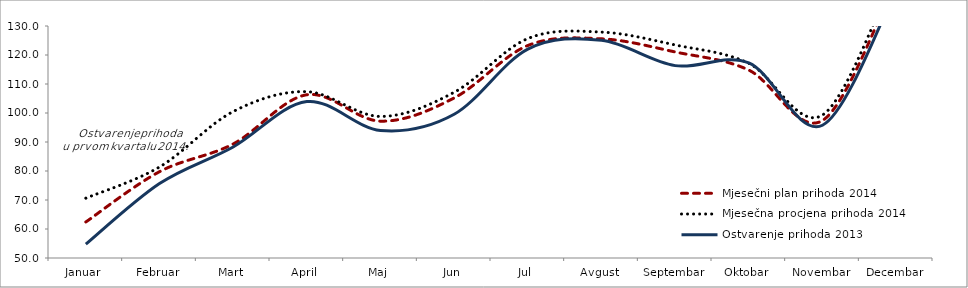
| Category | Mjesečni plan prihoda 2014 | Mjesečna procjena prihoda 2014 | Ostvarenje prihoda 2013 |
|---|---|---|---|
| Januar | 62425293.157 | 70632268.59 | 54757461.98 |
| Februar | 79762187.599 | 81381758.45 | 75673443.91 |
| Mart | 89318688.152 | 100495765.61 | 88296245.58 |
| April | 106294081.275 | 107356417.335 | 103948239.2 |
| Maj | 97189661.826 | 98816734.644 | 93997829.68 |
| Jun | 105191801.345 | 107147051.571 | 99561632.66 |
| Jul | 123272889.179 | 125666748.858 | 122021331.05 |
| Avgust | 125579133.653 | 127890096.387 | 125053427.65 |
| Septembar | 121047897.338 | 123465322.334 | 116342017.78 |
| Oktobar | 114789505.855 | 117130344.739 | 117283627.6 |
| Novembar | 97406301.48 | 99294843.071 | 95781753.16 |
| Decembar | 145778958.578 | 149056317.497 | 142429369.23 |